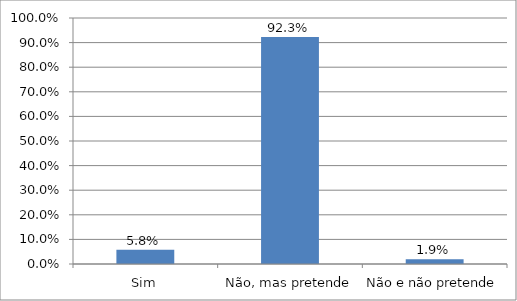
| Category | Series 0 |
|---|---|
| Sim | 0.058 |
| Não, mas pretende | 0.923 |
| Não e não pretende | 0.019 |